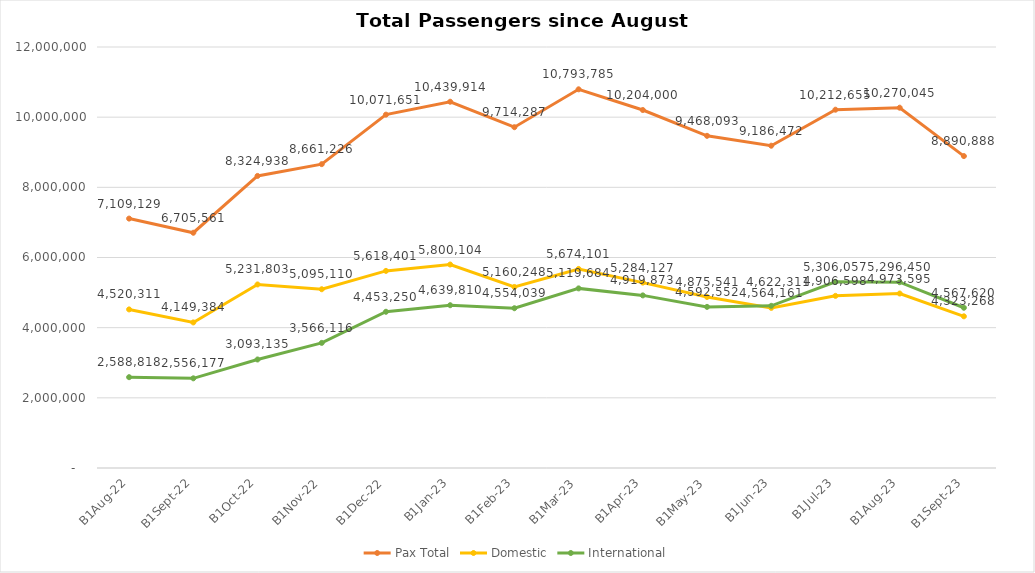
| Category | Pax Total | Domestic | International |
|---|---|---|---|
| 2022-08-01 | 7109129 | 4520311 | 2588818 |
| 2022-09-01 | 6705561 | 4149384 | 2556177 |
| 2022-10-01 | 8324938 | 5231803 | 3093135 |
| 2022-11-01 | 8661226 | 5095110 | 3566116 |
| 2022-12-01 | 10071651 | 5618401 | 4453250 |
| 2023-01-01 | 10439914 | 5800104 | 4639810 |
| 2023-02-01 | 9714287 | 5160248 | 4554039 |
| 2023-03-01 | 10793785 | 5674101 | 5119684 |
| 2023-04-01 | 10204000 | 5284127 | 4919873 |
| 2023-05-01 | 9468093 | 4875541 | 4592552 |
| 2023-06-01 | 9186472 | 4564161 | 4622311 |
| 2023-07-01 | 10212655 | 4906598 | 5306057 |
| 2023-08-01 | 10270045 | 4973595 | 5296450 |
| 2023-09-01 | 8890888 | 4323268 | 4567620 |